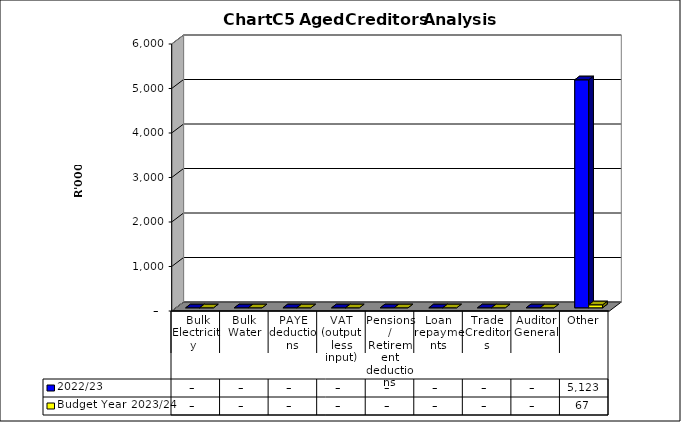
| Category | 2022/23 | Budget Year 2023/24 |
|---|---|---|
|  Bulk Electricity  | 0 | 0 |
| Bulk Water | 0 | 0 |
| PAYE deductions | 0 | 0 |
| VAT (output less input) | 0 | 0 |
| Pensions / Retirement deductions | 0 | 0 |
| Loan repayments | 0 | 0 |
| Trade Creditors | 0 | 0 |
| Auditor General | 0 | 0 |
| Other | 5123324.49 | 67216.48 |